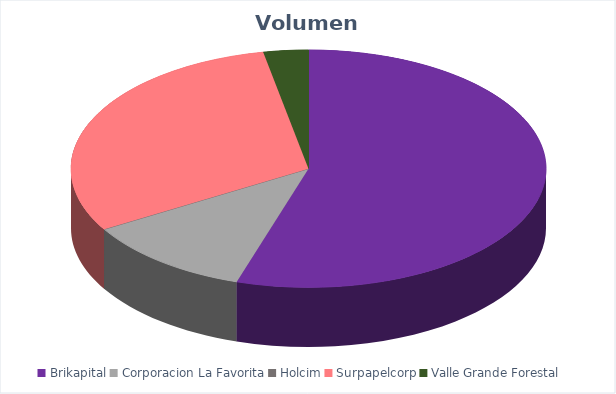
| Category | VOLUMEN ($USD) |
|---|---|
| Brikapital | 180000 |
| Corporacion La Favorita | 37972.62 |
| Holcim | 27.5 |
| Surpapelcorp | 99968.5 |
| Valle Grande Forestal | 10004.8 |